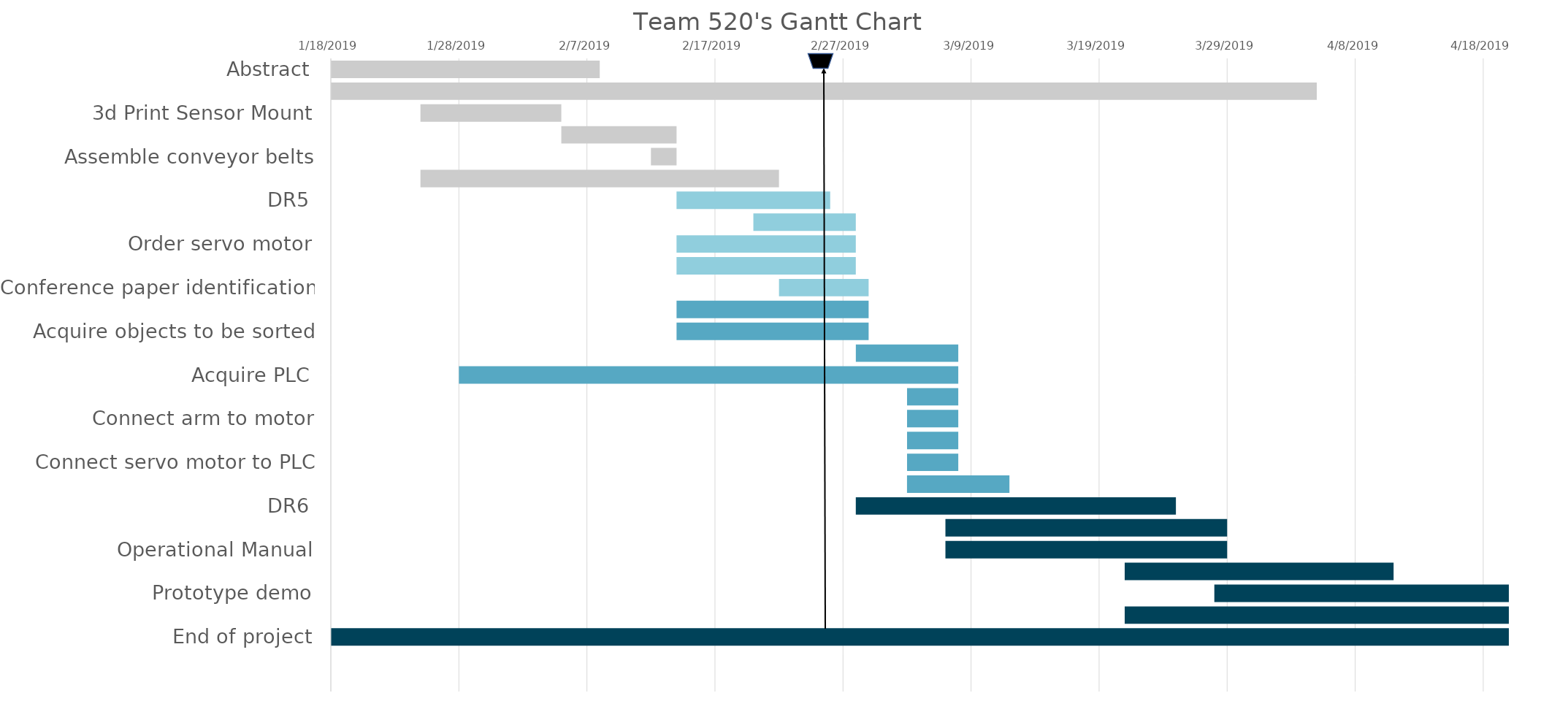
| Category | Start Dates | Duration |
|---|---|---|
| Abstract | 1/18/19 | 21 |
| Webpage Dev & Update | 1/18/19 | 77 |
| 3d Print Sensor Mount | 1/25/19 | 11 |
| Mount sensors | 2/5/19 | 9 |
| Assemble conveyor belts | 2/12/19 | 2 |
| High Resolution Graphic | 1/25/19 | 28 |
| DR5 | 2/14/19 | 12 |
| Risk Assessment | 2/20/19 | 8 |
| Order servo motor | 2/14/19 | 14 |
| 3d print diverter arm | 2/14/19 | 14 |
| Conference paper identification | 2/22/19 | 7 |
| Acquire bins for sorting | 2/14/19 | 15 |
| Acquire objects to be sorted | 2/14/19 | 15 |
| Poster | 2/28/19 | 8 |
| Acquire PLC | 1/28/19 | 39 |
| Mount motor to conveyor belt | 3/4/19 | 4 |
| Connect arm to motor | 3/4/19 | 4 |
| Connect sensors to PLC | 3/4/19 | 4 |
| Connect servo motor to PLC | 3/4/19 | 4 |
| Connect conveyor belts to PLC | 3/4/19 | 8 |
| DR6 | 2/28/19 | 25 |
| Conference paper | 3/7/19 | 22 |
| Operational Manual | 3/7/19 | 22 |
| Engineering Design Day | 3/21/19 | 21 |
| Prototype demo | 3/28/19 | 29 |
| Final report | 3/21/19 | 36 |
| End of project | 8/21/18 | 248 |